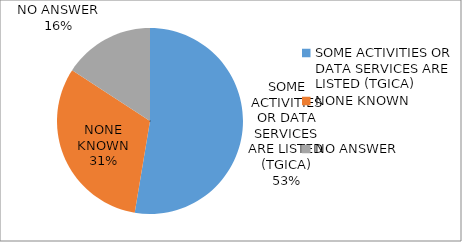
| Category | Series 0 |
|---|---|
| SOME ACTIVITIES OR DATA SERVICES ARE LISTED (TGICA) | 0.526 |
| NONE KNOWN | 0.316 |
| NO ANSWER | 0.158 |